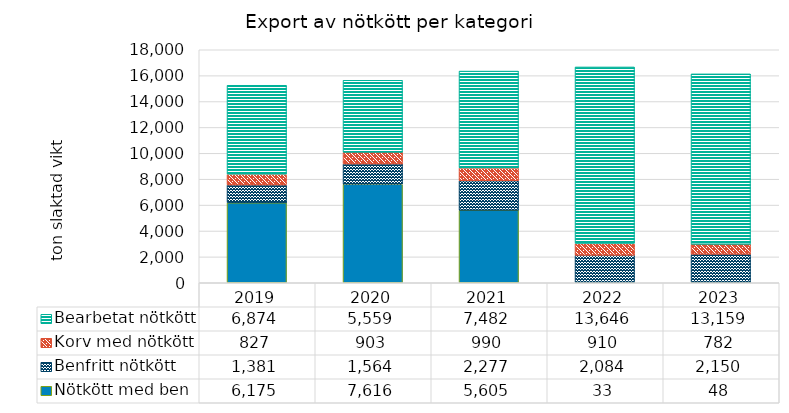
| Category | Nötkött med ben | Benfritt nötkött | Korv med nötkött | Bearbetat nötkött |
|---|---|---|---|---|
| 2019 | 6175 | 1381.429 | 826.5 | 6874.286 |
| 2020 | 7616 | 1564.286 | 902.571 | 5558.857 |
| 2021 | 5605 | 2277.143 | 989.786 | 7482.286 |
| 2022 | 33 | 2084.286 | 909.857 | 13645.714 |
| 2023 | 48 | 2150 | 781.714 | 13158.857 |